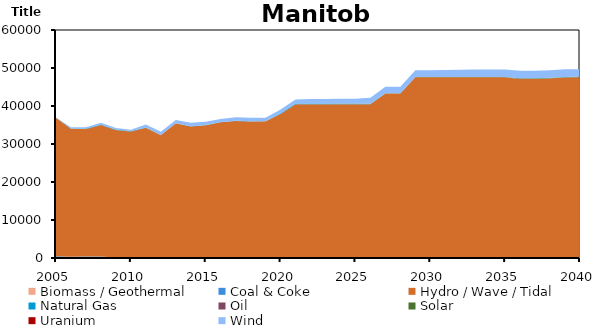
| Category | Biomass / Geothermal | Coal & Coke | Hydro / Wave / Tidal | Natural Gas | Oil | Solar | Uranium | Wind |
|---|---|---|---|---|---|---|---|---|
| 2005.0 | 27.33 | 413.257 | 36440 | 41.65 | 8.292 | 0 | 0 | 53 |
| 2006.0 | 32 | 316.984 | 33651 | 90.765 | 7.351 | 0 | 0 | 325 |
| 2007.0 | 27 | 380.97 | 33513 | 172.591 | 10.639 | 0 | 0 | 325 |
| 2008.0 | 38 | 380.185 | 34588 | 133.662 | 9.453 | 0 | 0 | 412 |
| 2009.0 | 0 | 137.785 | 33549 | 129.408 | 4.706 | 0 | 0 | 365 |
| 2010.0 | 0 | 43.573 | 33269 | 98.953 | 2.374 | 0 | 0 | 343 |
| 2011.0 | 0 | 48.774 | 34206 | 109.297 | 3.529 | 0 | 0 | 747 |
| 2012.0 | 39 | 50.541 | 32185 | 60.696 | 2.651 | 0 | 0 | 877 |
| 2013.0 | 42 | 64.182 | 35337 | 30.494 | 1.935 | 0 | 0 | 868 |
| 2014.0 | 64.4 | 67.617 | 34494.88 | 32.091 | 6.792 | 0 | 0 | 911.319 |
| 2015.0 | 72.6 | 83.711 | 34773.94 | 54.426 | 3.876 | 0 | 0 | 845.792 |
| 2016.0 | 86.9 | 42.199 | 35599.45 | 33.838 | 2.578 | 0 | 0 | 807.859 |
| 2017.0 | 56.3 | 29.245 | 35990.53 | 26.465 | 1.897 | 0 | 0 | 941.594 |
| 2018.0 | 56.3 | 29.245 | 35826.16 | 68.398 | 1.088 | 0 | 0 | 941.593 |
| 2019.0 | 56.3 | 29.245 | 35878.98 | 6.849 | 1.088 | 6.132 | 0 | 941.594 |
| 2020.0 | 56.3 | 0 | 37869.29 | 163.132 | 0.529 | 24.332 | 0 | 934.067 |
| 2021.0 | 56.3 | 0 | 40423.93 | 163.176 | 0.533 | 25.404 | 0 | 1046.714 |
| 2022.0 | 56.3 | 0 | 40423.97 | 163.176 | 0.533 | 26.28 | 0 | 1151.834 |
| 2023.0 | 56.3 | 0 | 40423.98 | 163.176 | 0.533 | 27.156 | 0 | 1151.834 |
| 2024.0 | 56.3 | 0 | 40423.95 | 115.742 | 0.533 | 45.552 | 0 | 1256.954 |
| 2025.0 | 56.3 | 0 | 40423.96 | 115.742 | 0.533 | 46.428 | 0 | 1256.953 |
| 2026.0 | 56.3 | 0 | 40423.98 | 43.015 | 0.533 | 47.304 | 0 | 1572.314 |
| 2027.0 | 56.3 | 0 | 43223.97 | 37.118 | 0.533 | 48.18 | 0 | 1677.434 |
| 2028.0 | 56.3 | 0 | 43223.95 | 37.118 | 0.533 | 66.576 | 0 | 1677.434 |
| 2029.0 | 56.3 | 0 | 47483.19 | 11.425 | 0.533 | 67.452 | 0 | 1782.554 |
| 2030.0 | 56.3 | 0 | 47483.18 | 5.496 | 0.533 | 68.328 | 0 | 1782.555 |
| 2031.0 | 56.3 | 0 | 47483.18 | 5.496 | 0.533 | 69.204 | 0 | 1887.674 |
| 2032.0 | 56.3 | 0 | 47483.16 | 5.496 | 0.533 | 87.6 | 0 | 1887.675 |
| 2033.0 | 56.3 | 0 | 47483.17 | 5.496 | 0.533 | 88.476 | 0 | 1992.794 |
| 2034.0 | 56.3 | 0 | 47483.17 | 5.496 | 0.533 | 89.352 | 0 | 1992.794 |
| 2035.0 | 56.3 | 0 | 47483.17 | 5.496 | 0.533 | 90.228 | 0 | 1992.794 |
| 2036.0 | 56.3 | 0 | 47076.35 | 43.015 | 0.533 | 108.624 | 0 | 1992.795 |
| 2037.0 | 56.3 | 0 | 47076.35 | 48.912 | 0.533 | 109.5 | 0 | 1992.795 |
| 2038.0 | 56.3 | 0 | 47236.24 | 43.015 | 0.533 | 110.376 | 0 | 1992.795 |
| 2039.0 | 56.3 | 0 | 47445.84 | 43.308 | 0.533 | 111.252 | 0 | 1992.795 |
| 2040.0 | 56.3 | 0 | 47483.18 | 45.492 | 0.533 | 128.772 | 0 | 1992.795 |